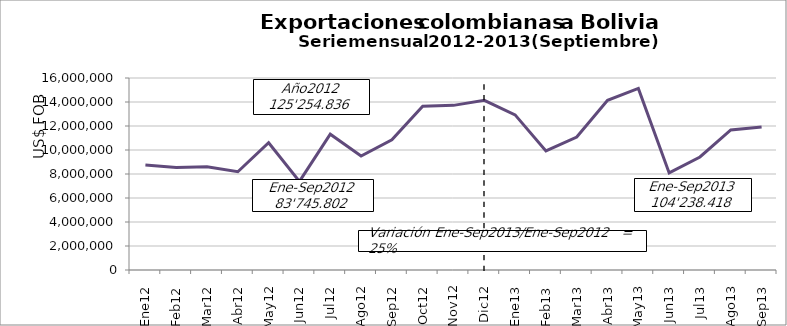
| Category | Series 0 |
|---|---|
| 0 | 8748189.83 |
| 1 | 8546422.09 |
| 2 | 8600413.58 |
| 3 | 8188547.01 |
| 4 | 10606781.81 |
| 5 | 7389078.9 |
| 6 | 11313604.03 |
| 7 | 9497804.43 |
| 8 | 10854960.8 |
| 9 | 13654522.77 |
| 10 | 13720161.38 |
| 11 | 14134349.35 |
| 12 | 12925432.06 |
| 13 | 9925535.26 |
| 14 | 11081326.9 |
| 15 | 14134985.42 |
| 16 | 15134095.69 |
| 17 | 8088623.44 |
| 18 | 9418054.28 |
| 19 | 11667241.69 |
| 20 | 11908122.93 |